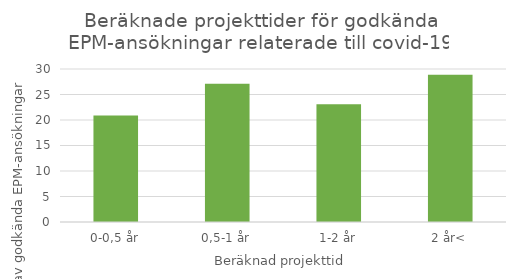
| Category | procent |
|---|---|
| 0-0,5 år | 20.889 |
| 0,5-1 år | 27.111 |
| 1-2 år | 23.111 |
| 2 år< | 28.889 |